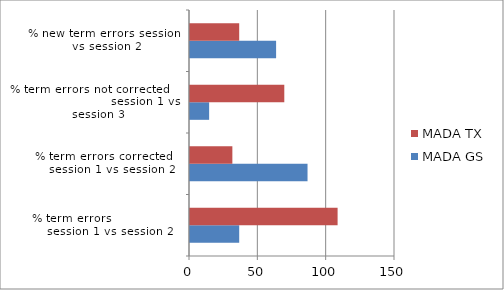
| Category | MADA GS | MADA TX |
|---|---|---|
| % term errors                       session 1 vs session 2 | 36 | 108 |
| % term errors corrected      session 1 vs session 2 | 86 | 31 |
| % term errors not corrected                            session 1 vs session 3 | 14 | 69 |
| % new term errors session 1 vs session 2 | 63 | 36 |